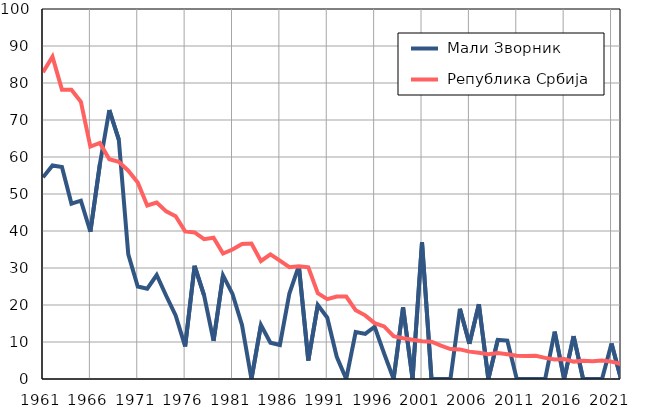
| Category |  Мали Зворник |  Република Србија |
|---|---|---|
| 1961.0 | 54.5 | 82.9 |
| 1962.0 | 57.7 | 87.1 |
| 1963.0 | 57.3 | 78.2 |
| 1964.0 | 47.4 | 78.2 |
| 1965.0 | 48.2 | 74.9 |
| 1966.0 | 39.8 | 62.8 |
| 1967.0 | 58 | 63.8 |
| 1968.0 | 72.7 | 59.4 |
| 1969.0 | 64.7 | 58.7 |
| 1970.0 | 33.7 | 56.3 |
| 1971.0 | 25 | 53.1 |
| 1972.0 | 24.4 | 46.9 |
| 1973.0 | 28.1 | 47.7 |
| 1974.0 | 22.5 | 45.3 |
| 1975.0 | 17.2 | 44 |
| 1976.0 | 8.8 | 39.9 |
| 1977.0 | 30.6 | 39.6 |
| 1978.0 | 22.6 | 37.8 |
| 1979.0 | 10.3 | 38.2 |
| 1980.0 | 28 | 33.9 |
| 1981.0 | 23 | 35 |
| 1982.0 | 14.6 | 36.5 |
| 1983.0 | 0 | 36.6 |
| 1984.0 | 14.6 | 31.9 |
| 1985.0 | 9.8 | 33.7 |
| 1986.0 | 9.2 | 32 |
| 1987.0 | 23.1 | 30.2 |
| 1988.0 | 30.6 | 30.5 |
| 1989.0 | 5 | 30.2 |
| 1990.0 | 20 | 23.2 |
| 1991.0 | 16.6 | 21.6 |
| 1992.0 | 6 | 22.3 |
| 1993.0 | 0 | 22.3 |
| 1994.0 | 12.7 | 18.6 |
| 1995.0 | 12.2 | 17.2 |
| 1996.0 | 14.1 | 15.1 |
| 1997.0 | 6.9 | 14.2 |
| 1998.0 | 0 | 11.6 |
| 1999.0 | 19.4 | 11 |
| 2000.0 | 0 | 10.6 |
| 2001.0 | 37 | 10.2 |
| 2002.0 | 0 | 10.1 |
| 2003.0 | 0 | 9 |
| 2004.0 | 0 | 8.1 |
| 2005.0 | 19 | 8 |
| 2006.0 | 9.5 | 7.4 |
| 2007.0 | 20.2 | 7.1 |
| 2008.0 | 0 | 6.7 |
| 2009.0 | 10.6 | 7 |
| 2010.0 | 10.4 | 6.7 |
| 2011.0 | 0 | 6.3 |
| 2012.0 | 0 | 6.2 |
| 2013.0 | 0 | 6.3 |
| 2014.0 | 0 | 5.7 |
| 2015.0 | 12.8 | 5.3 |
| 2016.0 | 0 | 5.4 |
| 2017.0 | 11.6 | 4.7 |
| 2018.0 | 0 | 4.9 |
| 2019.0 | 0 | 4.8 |
| 2020.0 | 0 | 5 |
| 2021.0 | 9.6 | 4.7 |
| 2022.0 | 0 | 4 |